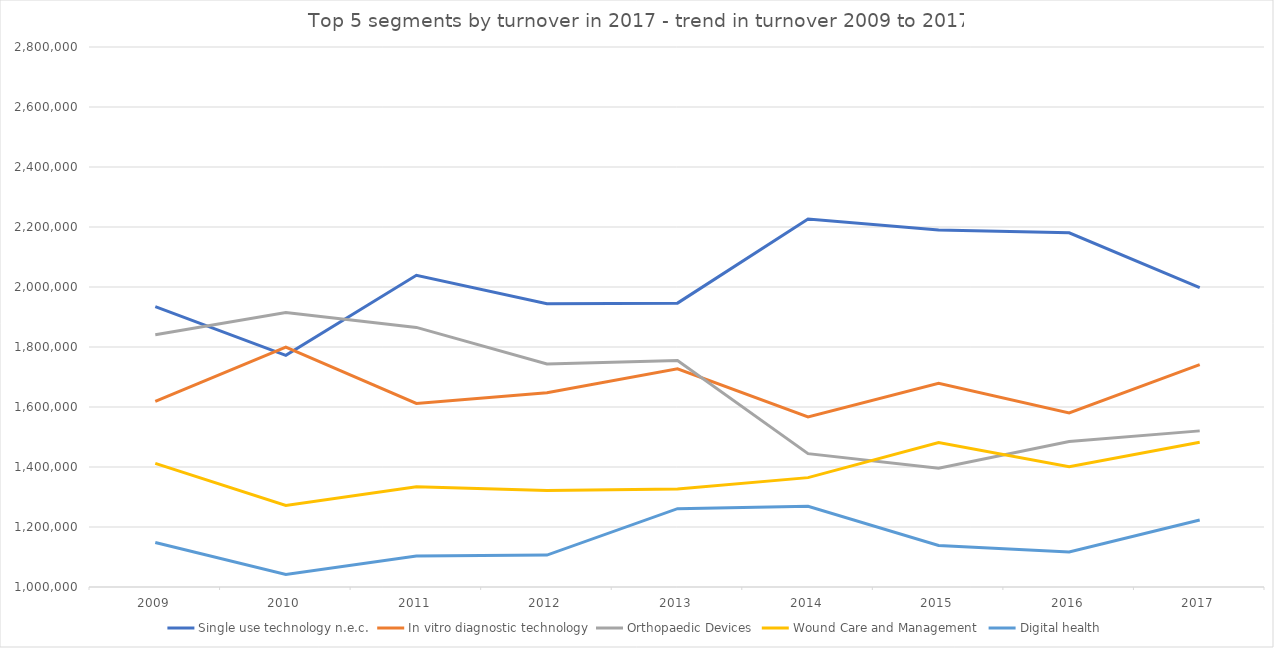
| Category |  Single use technology n.e.c.  |  In vitro diagnostic technology  |  Orthopaedic Devices  |  Wound Care and Management   |  Digital health  |
|---|---|---|---|---|---|
|  2009  | 1934489 | 1618801 | 1840837 | 1412301 | 1148311 |
|  2010  | 1772307 | 1799967 | 1915087 | 1272003 | 1041444 |
|  2011  | 2038863 | 1611868 | 1865372 | 1334401 | 1103064 |
|  2012  | 1944580 | 1647531 | 1743104 | 1321760 | 1106502 |
|  2013  | 1946237 | 1727370 | 1754847 | 1326396 | 1261082 |
|  2014  | 2226719 | 1567230 | 1444488 | 1364529 | 1268765 |
|  2015  | 2189609 | 1678874 | 1395611 | 1481312 | 1138240 |
|  2016  | 2180805 | 1579985 | 1485136 | 1400874 | 1116970 |
|  2017  | 1998166 | 1741066 | 1520402 | 1482608 | 1223149 |